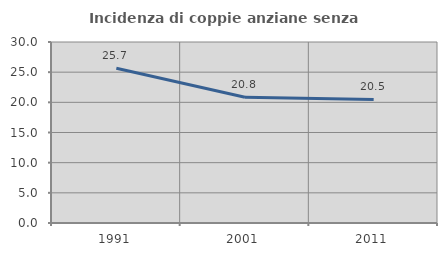
| Category | Incidenza di coppie anziane senza figli  |
|---|---|
| 1991.0 | 25.664 |
| 2001.0 | 20.833 |
| 2011.0 | 20.472 |